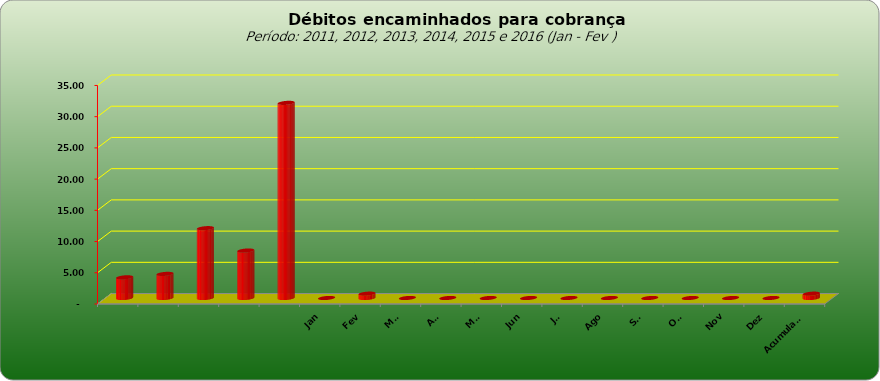
| Category |  3.309.443,02   3.859.728,44   11.181.928,25   7.600.526,01   31.248.623,50   -     695.716,82   -     -     -     -     -     -     -     -     -     -     695.716,82  |
|---|---|
|  | 3309443.02 |
|  | 3859728.44 |
|  | 11181928.25 |
|  | 7600526.01 |
|  | 31248623.5 |
| Jan | 0 |
| Fev | 695716.82 |
| Mar | 0 |
| Abr | 0 |
| Mai | 0 |
| Jun | 0 |
| Jul | 0 |
| Ago | 0 |
| Set | 0 |
| Out | 0 |
| Nov | 0 |
| Dez | 0 |
| Acumulado | 695716.82 |